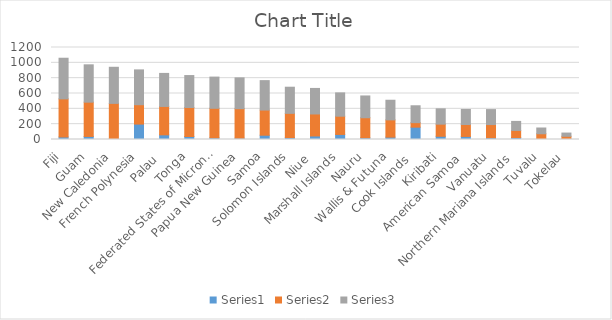
| Category | Series 0 | Series 1 | Series 2 |
|---|---|---|---|
| Fiji | 33 | 497 | 530 |
| Guam | 40 | 447 | 487 |
| New Caledonia | 9 | 462 | 471 |
| French Polynesia | 201 | 253 | 454 |
| Palau  | 61 | 370 | 431 |
| Tonga | 39 | 378 | 417 |
| Federated States of Micronesia | 22 | 385 | 407 |
| Papua New Guinea | 17 | 385 | 402 |
| Samoa | 56 | 328 | 384 |
| Solomon Islands | 25 | 316 | 341 |
| Niue  | 46 | 287 | 333 |
| Marshall Islands | 66 | 238 | 304 |
| Nauru | 23 | 261 | 284 |
| Wallis & Futuna | 31 | 225 | 256 |
| Cook Islands  | 161 | 59 | 220 |
| Kiribati | 42 | 158 | 200 |
| American Samoa  | 40 | 156 | 196 |
| Vanuatu | 23 | 172 | 195 |
| Northern Mariana Islands  | 26 | 92 | 118 |
| Tuvalu | 2 | 73 | 75 |
| Tokelau | 3 | 39 | 42 |